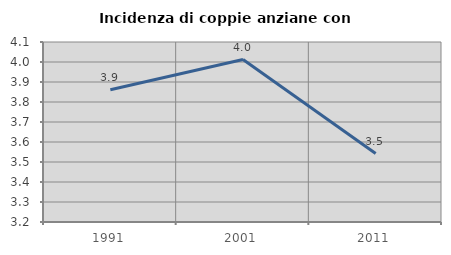
| Category | Incidenza di coppie anziane con figli |
|---|---|
| 1991.0 | 3.861 |
| 2001.0 | 4.012 |
| 2011.0 | 3.542 |